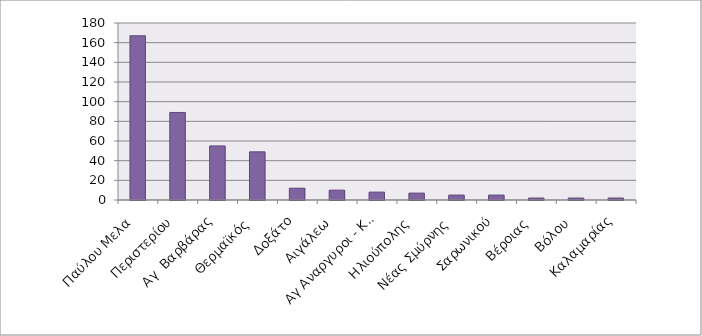
| Category | 2019 - ωφελούμενοι από την Κλίματα αυτοεξέτασης στο λογισμικό |
|---|---|
| Παύλου Μελα  | 167 |
| Περιστερίου  | 89 |
| Αγ  Βαρβάρας  | 55 |
| Θερμαϊκός  | 49 |
| Δοξάτο | 12 |
| Αιγάλεω  | 10 |
| Αγ Αναργυροι - Καματερό  | 8 |
| Ηλιούπολης  | 7 |
| Νέας Σμύρνης  | 5 |
| Σαρωνικού | 5 |
| Βέροιας  | 2 |
| Βόλου  | 2 |
| Καλαμαρίας  | 2 |